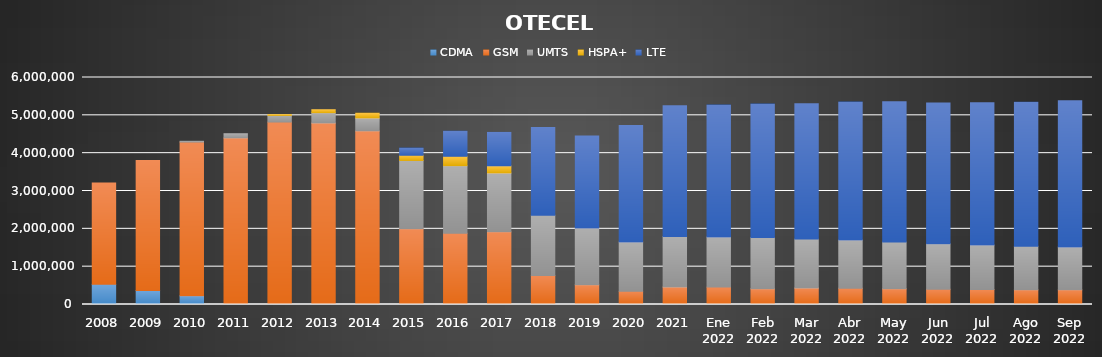
| Category | CDMA | GSM | UMTS | HSPA+ | LTE |
|---|---|---|---|---|---|
| 2008 | 533206 | 2678716 | 0 | 0 | 0 |
| 2009 | 370711 | 3435721 | 0 | 0 | 0 |
| 2010 | 232396 | 4061909 | 20294 | 0 | 0 |
| 2011 | 0 | 4403305 | 110569 | 0 | 0 |
| 2012 | 0 | 4823675 | 174375 | 21636 | 0 |
| 2013 | 0 | 4797632 | 272871 | 77805 | 0 |
| 2014 | 0 | 4589205 | 341647 | 124793 | 0 |
| 2015 | 0 | 2002436 | 1805322 | 136952 | 189988 |
| 2016 | 0 | 1881781 | 1787014 | 248541 | 662756 |
| 2017 | 0 | 1924184.634 | 1552693.066 | 187515.199 | 884631.101 |
| 2018 | 0 | 765658.891 | 1596404.415 | 0 | 2317582.694 |
| 2019 | 0 | 525011.505 | 1498097.705 | 0 | 2433246.79 |
| 2020 | 0 | 348601.621 | 1305745.099 | 0 | 3075378.28 |
| 2021 | 0 | 463116 | 1335075 | 0 | 3456277 |
| Ene 2022 | 0 | 461271.915 | 1324789.367 | 0 | 3486728.718 |
| Feb 2022 | 0 | 419568.449 | 1353562.987 | 0 | 3524816.564 |
| Mar 2022 | 0 | 438224.686 | 1291201.748 | 0 | 3579803.566 |
| Abr 2022 | 0 | 431954.615 | 1274369.387 | 0 | 3643464.999 |
| May 2022 | 0 | 416835.41 | 1233843.984 | 0 | 3707652.607 |
| Jun 2022 | 0 | 404442.897 | 1201100.892 | 0 | 3721062.21 |
| Jul 2022 | 0 | 398450.905 | 1177412.14 | 0 | 3758364.955 |
| Ago 2022 | 0 | 389926.74 | 1151449.27 | 0 | 3804394.989 |
| Sep 2022 | 0 | 388701.773 | 1132654.42 | 0 | 3864998.807 |